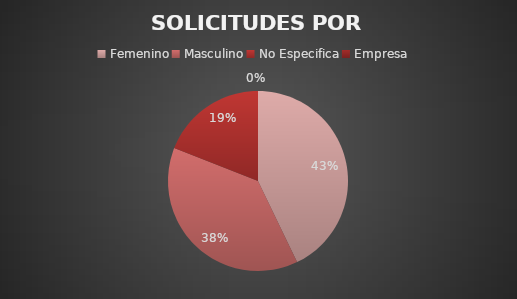
| Category | Series 0 |
|---|---|
| Femenino | 9 |
| Masculino | 8 |
| No Especifica | 4 |
| Empresa | 0 |